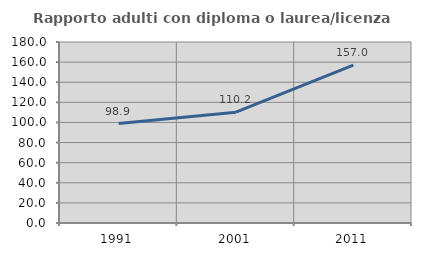
| Category | Rapporto adulti con diploma o laurea/licenza media  |
|---|---|
| 1991.0 | 98.855 |
| 2001.0 | 110.217 |
| 2011.0 | 157.001 |